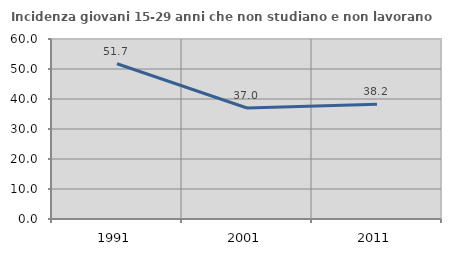
| Category | Incidenza giovani 15-29 anni che non studiano e non lavorano  |
|---|---|
| 1991.0 | 51.743 |
| 2001.0 | 36.996 |
| 2011.0 | 38.249 |